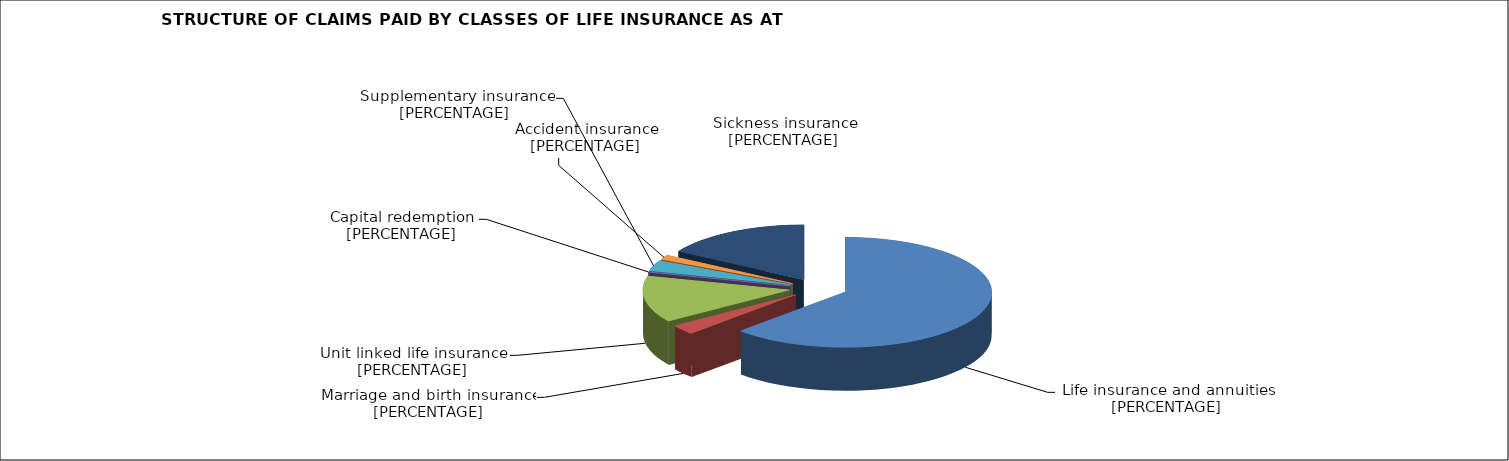
| Category | Life insurance and annuities |
|---|---|
| 0.6256517356311737 | 0.626 |
| 0.028232766373294346 | 0.028 |
| 0.13710945681880254 | 0.137 |
| 0.0 | 0 |
| 0.031593269627154266 | 0.032 |
| 0.013931383498373112 | 0.014 |
| 0.16348138805120196 | 0.163 |